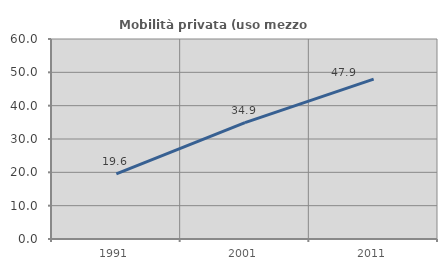
| Category | Mobilità privata (uso mezzo privato) |
|---|---|
| 1991.0 | 19.568 |
| 2001.0 | 34.916 |
| 2011.0 | 47.94 |